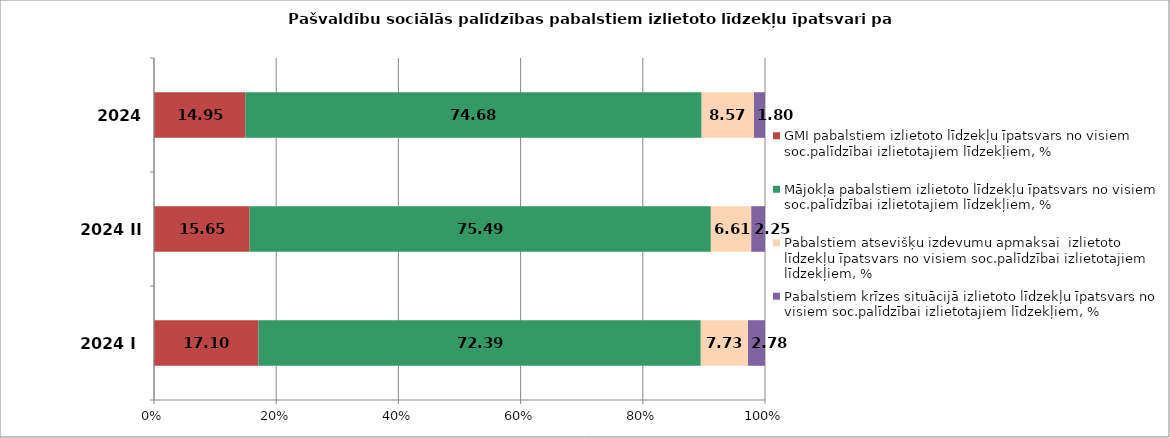
| Category | GMI pabalstiem izlietoto līdzekļu īpatsvars no visiem soc.palīdzībai izlietotajiem līdzekļiem, % | Mājokļa pabalstiem izlietoto līdzekļu īpatsvars no visiem soc.palīdzībai izlietotajiem līdzekļiem, % | Pabalstiem atsevišķu izdevumu apmaksai  izlietoto līdzekļu īpatsvars no visiem soc.palīdzībai izlietotajiem līdzekļiem, % | Pabalstiem krīzes situācijā izlietoto līdzekļu īpatsvars no visiem soc.palīdzībai izlietotajiem līdzekļiem, % |
|---|---|---|---|---|
| 2024 I | 17.1 | 72.39 | 7.73 | 2.78 |
| 2024 II | 15.65 | 75.49 | 6.61 | 2.25 |
| 2024 III | 14.95 | 74.68 | 8.57 | 1.8 |